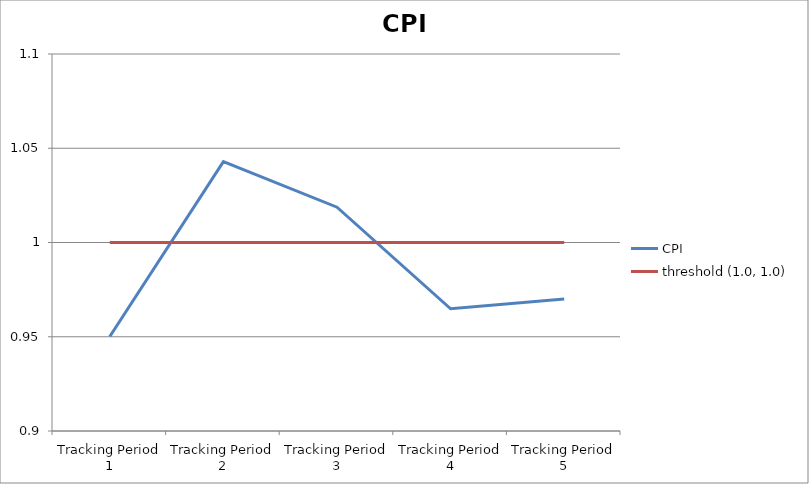
| Category | CPI | threshold (1.0, 1.0) |
|---|---|---|
| Tracking Period 1 | 0.95 | 1 |
| Tracking Period 2 | 1.043 | 1 |
| Tracking Period 3 | 1.019 | 1 |
| Tracking Period 4 | 0.965 | 1 |
| Tracking Period 5 | 0.97 | 1 |